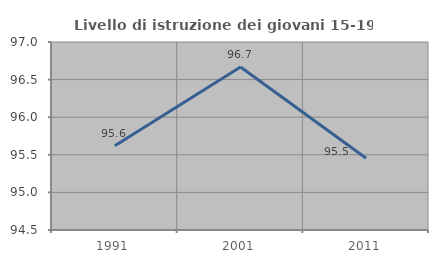
| Category | Livello di istruzione dei giovani 15-19 anni |
|---|---|
| 1991.0 | 95.62 |
| 2001.0 | 96.667 |
| 2011.0 | 95.455 |